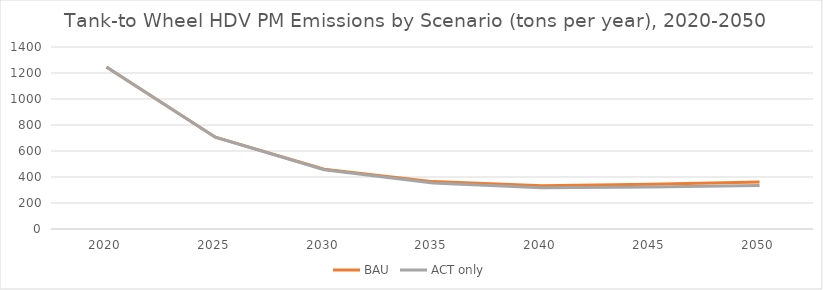
| Category | BAU | ACT only |
|---|---|---|
| 2020.0 | 1246.703 | 1246.703 |
| 2025.0 | 705.829 | 705.829 |
| 2030.0 | 459.329 | 456.259 |
| 2035.0 | 364.438 | 354.227 |
| 2040.0 | 332.791 | 318.183 |
| 2045.0 | 344.663 | 323.311 |
| 2050.0 | 362.083 | 334.784 |